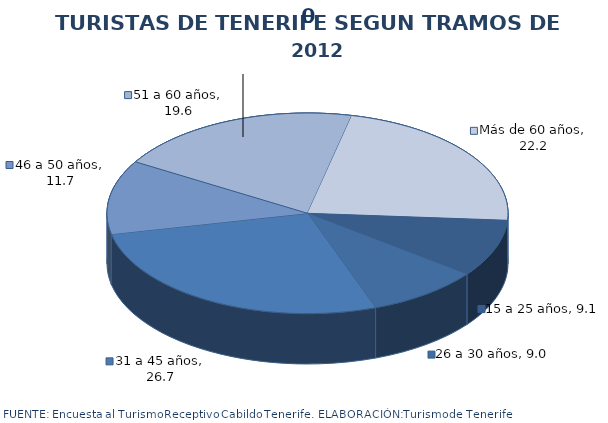
| Category | 2012 |
|---|---|
| 15 a 25 años | 9.118 |
| 26 a 30 años | 8.964 |
| 31 a 45 años | 26.736 |
| 46 a 50 años | 11.718 |
| 51 a 60 años | 19.645 |
| Más de 60 años | 22.2 |